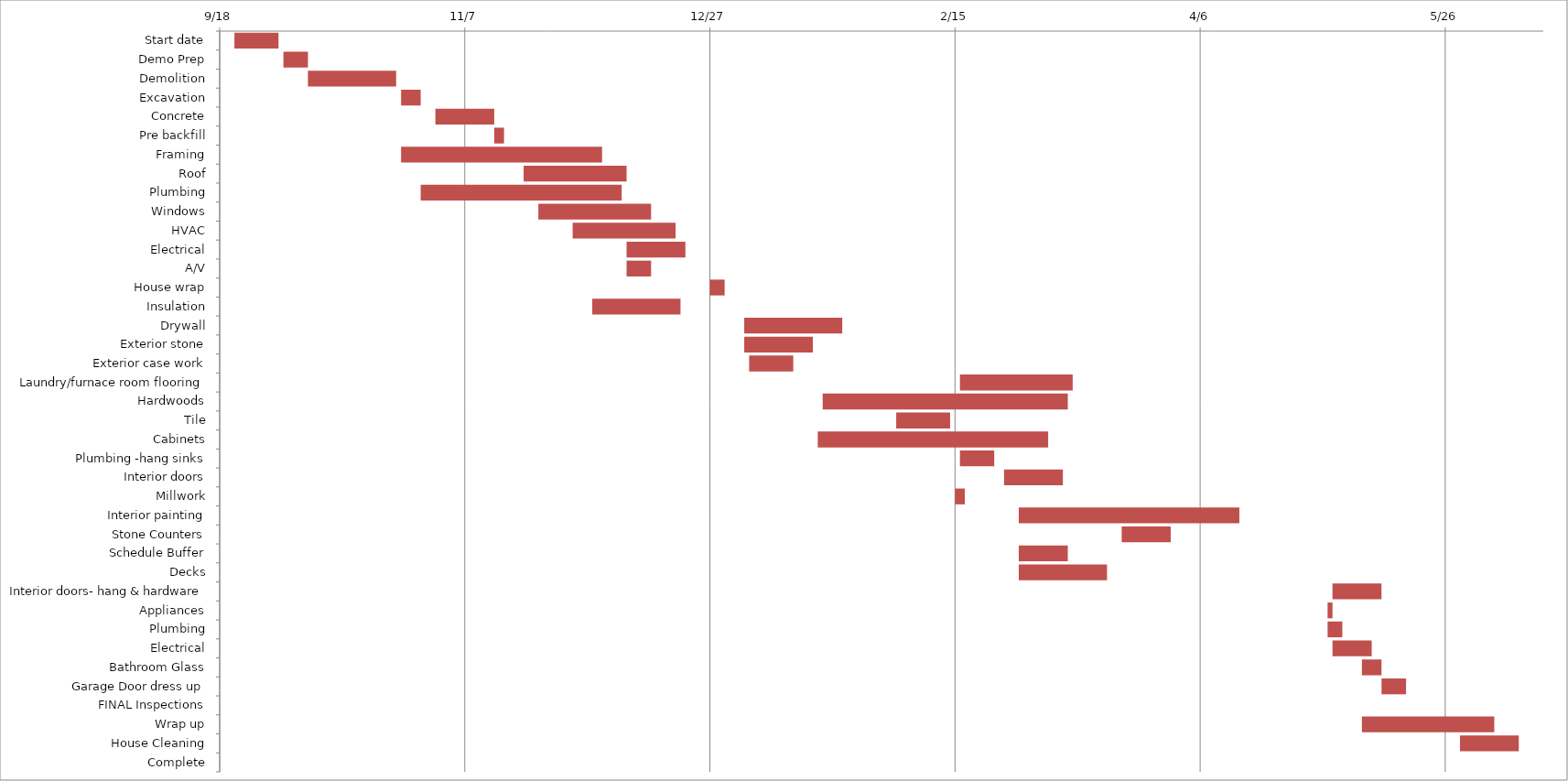
| Category | Start Date | Duration |
|---|---|---|
| Start date | 9/21/14 | 9 |
| Demo Prep | 10/1/14 | 5 |
| Demolition | 10/6/14 | 18 |
| Excavation | 10/25/14 | 4 |
| Concrete | 11/1/14 | 12 |
| Pre backfill | 11/13/14 | 2 |
| Framing | 10/25/14 | 41 |
| Roof | 11/19/14 | 21 |
| Plumbing | 10/29/14 | 41 |
| Windows | 11/22/14 | 23 |
| HVAC | 11/29/14 | 21 |
| Electrical | 12/10/14 | 12 |
| A/V | 12/10/14 | 5 |
| House wrap | 12/27/14 | 3 |
| Insulation | 12/3/14 | 18 |
| Drywall | 1/3/15 | 20 |
| Exterior stone | 1/3/15 | 14 |
| Exterior case work | 1/4/15 | 9 |
| Laundry/furnace room flooring | 2/16/15 | 23 |
| Hardwoods | 1/19/15 | 50 |
| Tile | 2/3/15 | 11 |
| Cabinets | 1/18/15 | 47 |
| Plumbing -hang sinks | 2/16/15 | 7 |
| Interior doors | 2/25/15 | 12 |
| Millwork | 2/15/15 | 2 |
| Interior painting | 2/28/15 | 45 |
| Stone Counters | 3/21/15 | 10 |
| Schedule Buffer | 2/28/15 | 10 |
| Decks | 2/28/15 | 18 |
| Interior doors- hang & hardware | 5/3/15 | 10 |
| Appliances | 5/2/15 | 1 |
| Plumbing | 5/2/15 | 3 |
| Electrical | 5/3/15 | 8 |
| Bathroom Glass | 5/9/15 | 4 |
| Garage Door dress up | 5/13/15 | 5 |
| FINAL Inspections | 5/2/15 | 0 |
| Wrap up | 5/9/15 | 27 |
| House Cleaning | 5/29/15 | 12 |
| Complete | 6/1/15 | 0 |